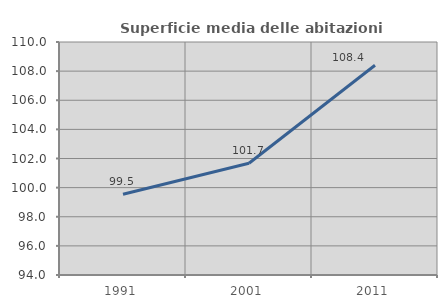
| Category | Superficie media delle abitazioni occupate |
|---|---|
| 1991.0 | 99.546 |
| 2001.0 | 101.67 |
| 2011.0 | 108.401 |